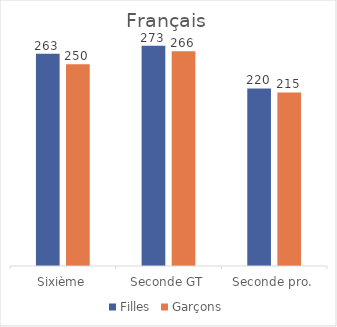
| Category | Filles | Garçons |
|---|---|---|
| Sixième | 263 | 250 |
| Seconde GT | 273 | 266 |
| Seconde pro. | 220 | 215 |